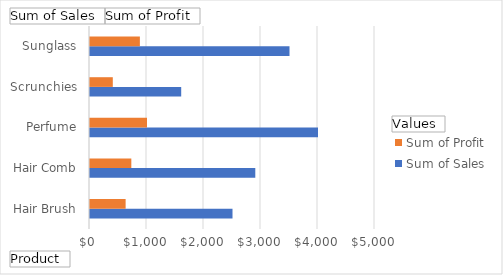
| Category | Sum of Sales | Sum of Profit |
|---|---|---|
| Hair Brush | 2500 | 625 |
| Hair Comb | 2900 | 725 |
| Perfume | 4000 | 1000 |
| Scrunchies | 1600 | 400 |
| Sunglass | 3500 | 875 |